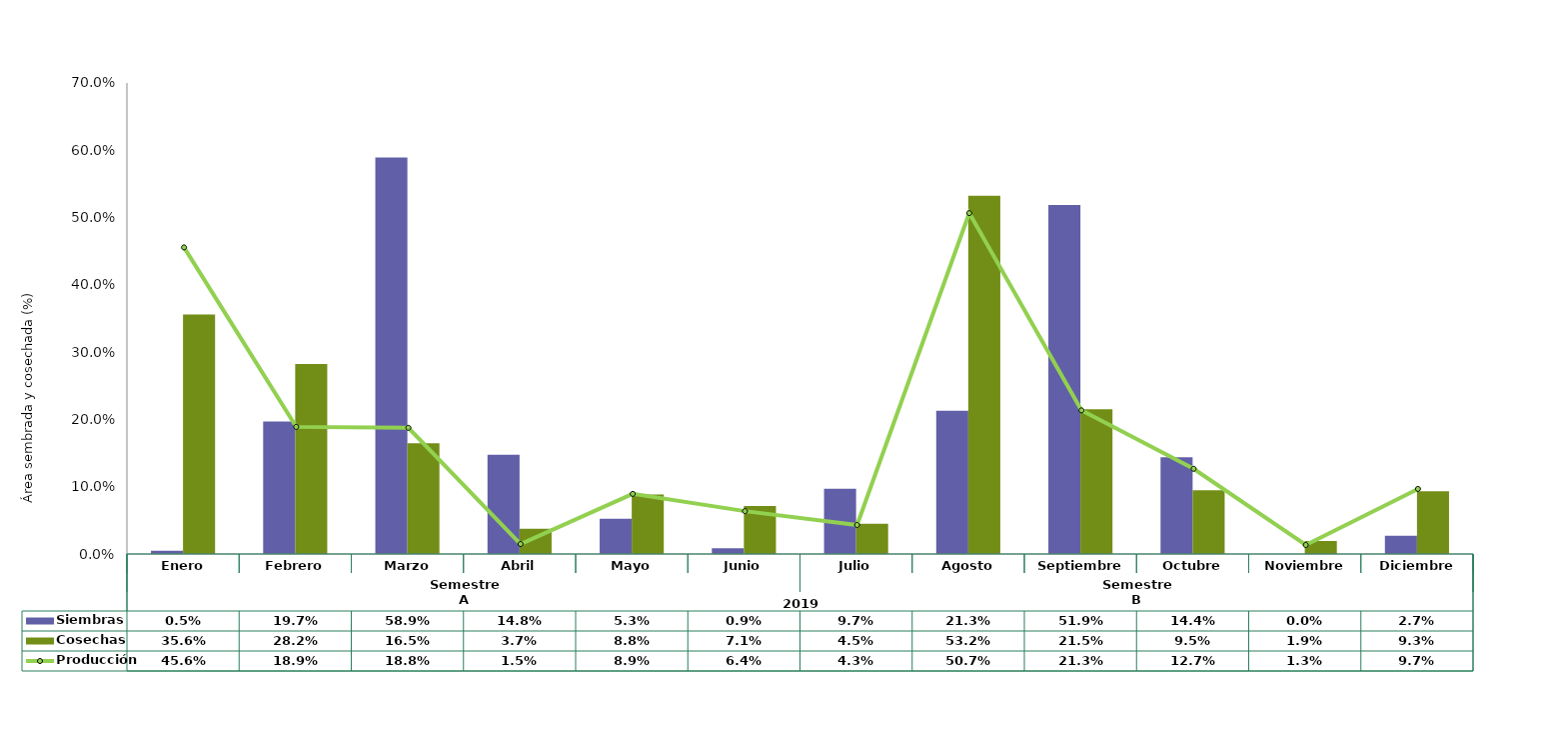
| Category | Siembras | Cosechas   |
|---|---|---|
| 0 | 0.005 | 0.356 |
| 1 | 0.197 | 0.282 |
| 2 | 0.589 | 0.165 |
| 3 | 0.148 | 0.037 |
| 4 | 0.053 | 0.088 |
| 5 | 0.009 | 0.071 |
| 6 | 0.097 | 0.045 |
| 7 | 0.213 | 0.532 |
| 8 | 0.519 | 0.215 |
| 9 | 0.144 | 0.095 |
| 10 | 0 | 0.019 |
| 11 | 0.027 | 0.093 |